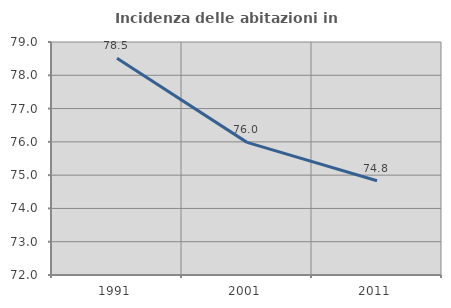
| Category | Incidenza delle abitazioni in proprietà  |
|---|---|
| 1991.0 | 78.511 |
| 2001.0 | 75.984 |
| 2011.0 | 74.83 |